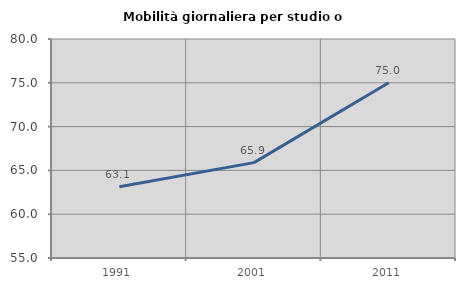
| Category | Mobilità giornaliera per studio o lavoro |
|---|---|
| 1991.0 | 63.14 |
| 2001.0 | 65.885 |
| 2011.0 | 75 |